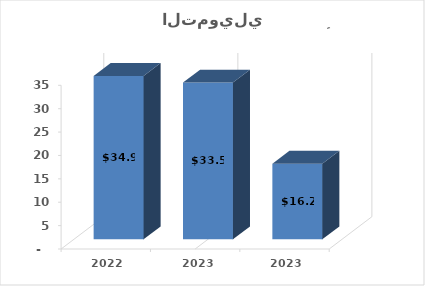
| Category | Series 0 |
|---|---|
| الربع الرابع 2023 | 16167327 |
| الربع الثالث  2023 | 33502242 |
| الربع الرابع 2022 | 34920147 |